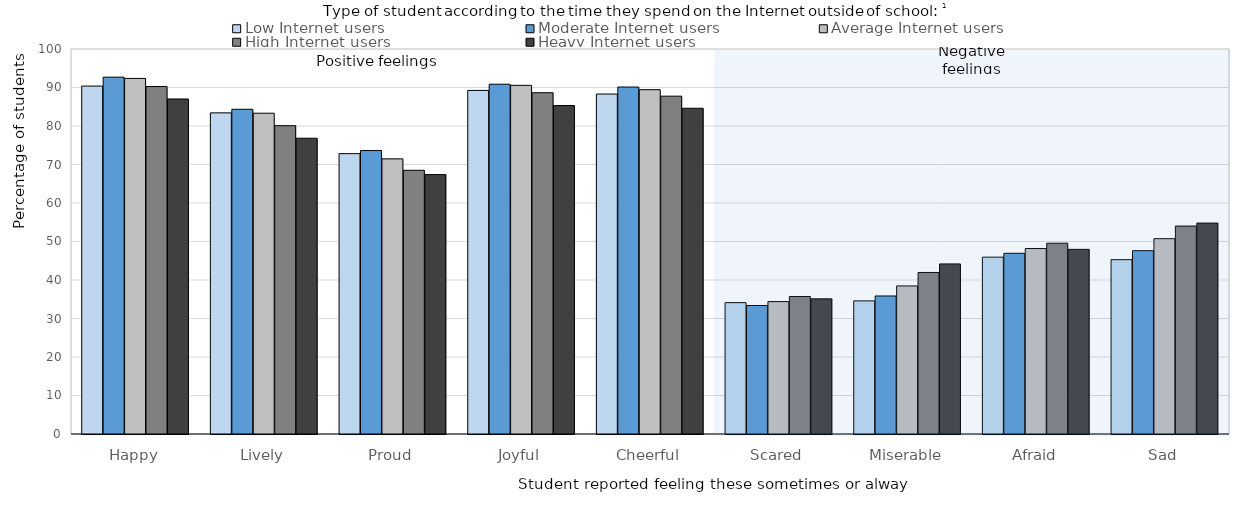
| Category | Low Internet users | Moderate Internet users | Average Internet users | High Internet users | Heavy Internet users |
|---|---|---|---|---|---|
| Happy | 90.371 | 92.69 | 92.362 | 90.249 | 87.019 |
| Lively | 83.41 | 84.345 | 83.321 | 80.085 | 76.819 |
| Proud | 72.819 | 73.624 | 71.469 | 68.496 | 67.379 |
| Joyful | 89.243 | 90.853 | 90.561 | 88.644 | 85.315 |
| Cheerful | 88.3 | 90.119 | 89.438 | 87.749 | 84.607 |
| Scared | 34.116 | 33.374 | 34.388 | 35.71 | 35.105 |
| Miserable | 34.575 | 35.851 | 38.46 | 41.953 | 44.178 |
| Afraid | 45.934 | 46.933 | 48.172 | 49.553 | 47.962 |
| Sad | 45.281 | 47.61 | 50.734 | 54.011 | 54.787 |